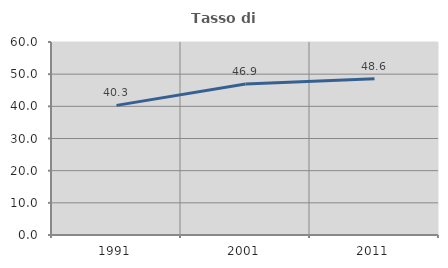
| Category | Tasso di occupazione   |
|---|---|
| 1991.0 | 40.296 |
| 2001.0 | 46.935 |
| 2011.0 | 48.603 |